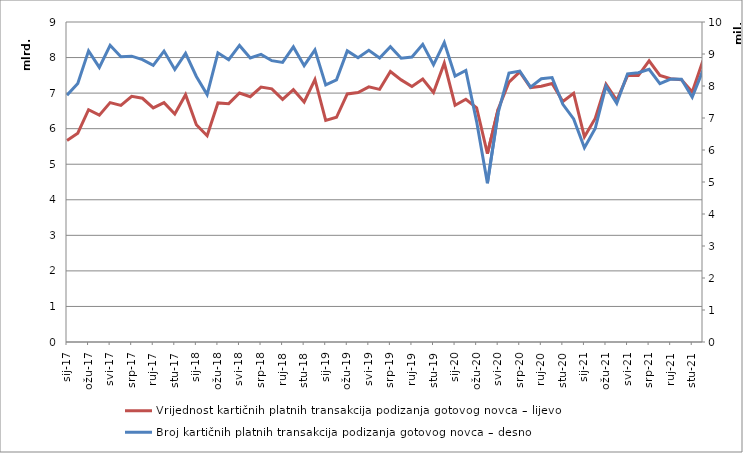
| Category | Vrijednost kartičnih platnih transakcija podizanja gotovog novca – lijevo |
|---|---|
| 2017-01-01 | 5666038801 |
| 2017-02-01 | 5872617770 |
| 2017-03-01 | 6532401746 |
| 2017-04-01 | 6381224799 |
| 2017-05-01 | 6733357752 |
| 2017-06-01 | 6652542580 |
| 2017-07-01 | 6911790845 |
| 2017-08-01 | 6854972720 |
| 2017-09-01 | 6582349265 |
| 2017-10-01 | 6730793169 |
| 2017-11-01 | 6412821254 |
| 2017-12-01 | 6954726818 |
| 2018-01-01 | 6109852398 |
| 2018-02-01 | 5802305920 |
| 2018-03-01 | 6723678447 |
| 2018-04-01 | 6703397142 |
| 2018-05-01 | 7003655927 |
| 2018-06-01 | 6898560809 |
| 2018-07-01 | 7170032002 |
| 2018-08-01 | 7119389645 |
| 2018-09-01 | 6822560273 |
| 2018-10-01 | 7094779360 |
| 2018-11-01 | 6750920337 |
| 2018-12-01 | 7383228008 |
| 2019-01-01 | 6233298869 |
| 2019-02-01 | 6319568186 |
| 2019-03-01 | 6976532602 |
| 2019-04-01 | 7016082649 |
| 2019-05-01 | 7174491760 |
| 2019-06-01 | 7105294004 |
| 2019-07-01 | 7605705783 |
| 2019-08-01 | 7371838879 |
| 2019-09-01 | 7187827062 |
| 2019-10-01 | 7393909656 |
| 2019-11-01 | 7016638376 |
| 2019-12-01 | 7842206635 |
| 2020-01-01 | 6659395562 |
| 2020-02-01 | 6827064486 |
| 2020-03-01 | 6588633239 |
| 2020-04-01 | 5296130983 |
| 2020-05-01 | 6548167544 |
| 2020-06-01 | 7310296856 |
| 2020-07-01 | 7597669559 |
| 2020-08-01 | 7156159858 |
| 2020-09-01 | 7193976728 |
| 2020-10-01 | 7270314404 |
| 2020-11-01 | 6764190056 |
| 2020-12-01 | 6996163051 |
| 2021-01-01 | 5769024394 |
| 2021-02-01 | 6286674300 |
| 2021-03-01 | 7249898119 |
| 2021-04-01 | 6795315552 |
| 2021-05-01 | 7492921741 |
| 2021-06-01 | 7492000934 |
| 2021-07-01 | 7908855709 |
| 2021-08-01 | 7498077170 |
| 2021-09-01 | 7405297466 |
| 2021-10-01 | 7375750978 |
| 2021-11-01 | 7030283264 |
| 2021-12-01 | 7914334107 |